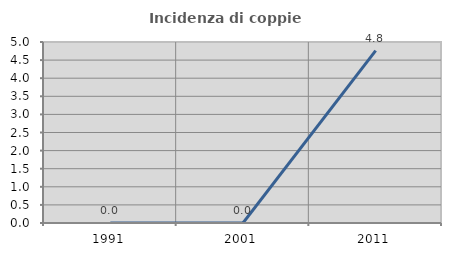
| Category | Incidenza di coppie miste |
|---|---|
| 1991.0 | 0 |
| 2001.0 | 0 |
| 2011.0 | 4.762 |